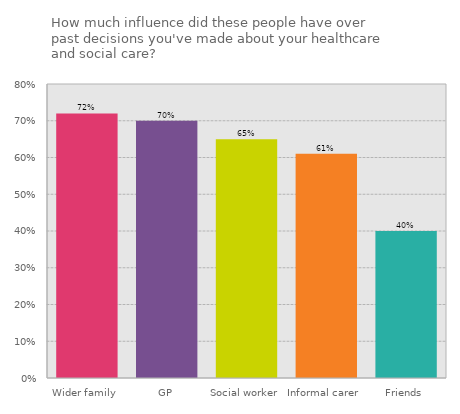
| Category | A lot of influence |
|---|---|
| Wider family | 0.72 |
| GP | 0.7 |
| Social worker | 0.65 |
| Informal carer | 0.61 |
| Friends | 0.4 |